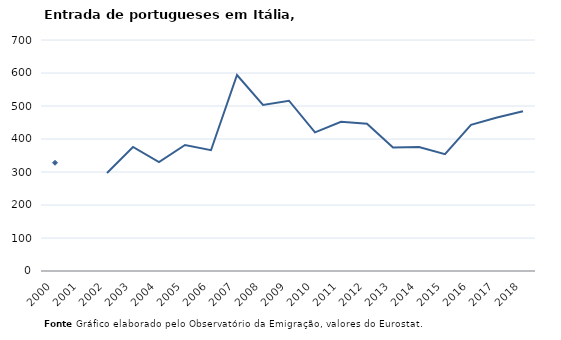
| Category | Entradas |
|---|---|
| 2000.0 | 328 |
| 2001.0 | 0 |
| 2002.0 | 297 |
| 2003.0 | 376 |
| 2004.0 | 330 |
| 2005.0 | 382 |
| 2006.0 | 366 |
| 2007.0 | 594 |
| 2008.0 | 503 |
| 2009.0 | 516 |
| 2010.0 | 420 |
| 2011.0 | 452 |
| 2012.0 | 446 |
| 2013.0 | 374 |
| 2014.0 | 376 |
| 2015.0 | 354 |
| 2016.0 | 443 |
| 2017.0 | 465 |
| 2018.0 | 484 |